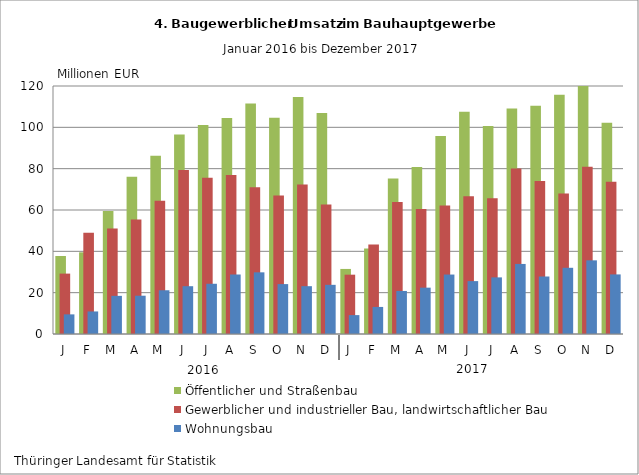
| Category | Öffentlicher und Straßenbau | Gewerblicher und industrieller Bau, landwirtschaftlicher Bau | Wohnungsbau |
|---|---|---|---|
| J | 37.745 | 29.222 | 9.498 |
| F | 39.526 | 48.996 | 10.913 |
| M | 59.523 | 50.995 | 18.459 |
| A | 76.115 | 55.414 | 18.527 |
| M | 86.192 | 64.485 | 21.164 |
| J | 96.567 | 79.41 | 23.127 |
| J | 101.101 | 75.636 | 24.305 |
| A | 104.512 | 76.957 | 28.792 |
| S | 111.544 | 71.016 | 29.839 |
| O | 104.591 | 67.05 | 24.147 |
| N | 114.728 | 72.329 | 23.139 |
| D | 106.876 | 62.64 | 23.791 |
| J | 31.481 | 28.702 | 9.142 |
| F | 41.377 | 43.352 | 13.095 |
| M | 75.221 | 63.897 | 20.825 |
| A | 80.805 | 60.502 | 22.423 |
| M | 95.86 | 62.218 | 28.766 |
| J | 107.505 | 66.678 | 25.592 |
| J | 100.59 | 65.637 | 27.396 |
| A | 109.13 | 80.114 | 33.897 |
| S | 110.425 | 74.031 | 27.821 |
| O | 115.76 | 67.977 | 32.036 |
| N | 120.983 | 80.914 | 35.639 |
| D | 102.201 | 73.722 | 28.832 |